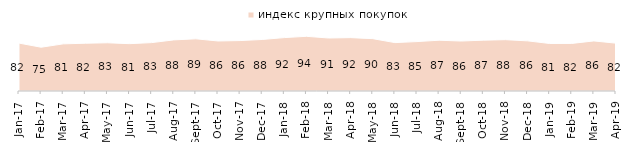
| Category | индекс крупных покупок |
|---|---|
| 2017-01-01 | 82.1 |
| 2017-02-01 | 75.05 |
| 2017-03-01 | 80.8 |
| 2017-04-01 | 81.9 |
| 2017-05-01 | 82.65 |
| 2017-06-01 | 81.15 |
| 2017-07-01 | 82.95 |
| 2017-08-01 | 87.6 |
| 2017-09-01 | 89.45 |
| 2017-10-01 | 85.75 |
| 2017-11-01 | 86.45 |
| 2017-12-01 | 88.3 |
| 2018-01-01 | 91.55 |
| 2018-02-01 | 93.75 |
| 2018-03-01 | 90.85 |
| 2018-04-01 | 91.5 |
| 2018-05-01 | 89.75 |
| 2018-06-01 | 82.95 |
| 2018-07-01 | 84.7 |
| 2018-08-01 | 87.05 |
| 2018-09-01 | 85.65 |
| 2018-10-01 | 87.15 |
| 2018-11-01 | 87.974 |
| 2018-12-01 | 85.95 |
| 2019-01-01 | 81.45 |
| 2019-02-01 | 81.55 |
| 2019-03-01 | 85.828 |
| 2019-04-01 | 81.98 |